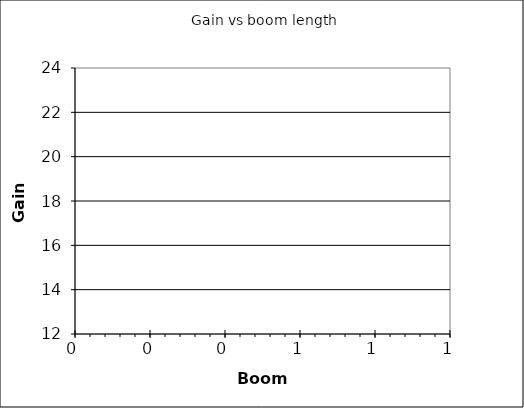
| Category | Gain (dBi) |
|---|---|
| 0.0 | 13.95 |
| 0.0 | 14.95 |
| 0.0 | 15.95 |
| 0.0 | 16.95 |
| 0.0 | 17.95 |
| 0.0 | 18.95 |
| 0.0 | 19.95 |
| 0.0 | 20.95 |
| 0.0 | 21.95 |
| 0.0 | 22.95 |
| 0.0 | 23.75 |